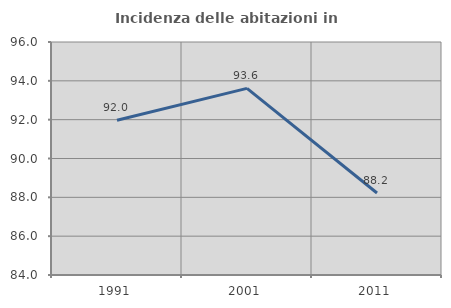
| Category | Incidenza delle abitazioni in proprietà  |
|---|---|
| 1991.0 | 91.972 |
| 2001.0 | 93.613 |
| 2011.0 | 88.224 |